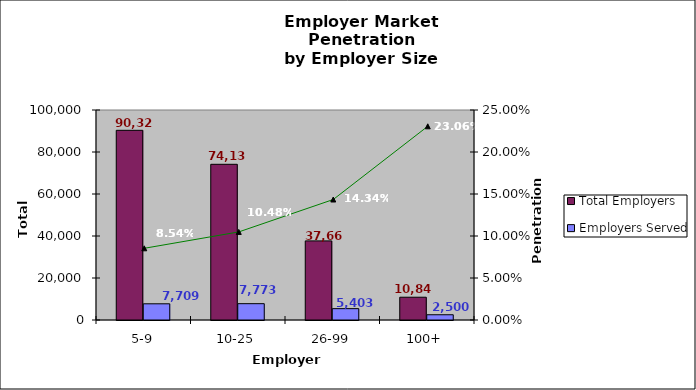
| Category | Total Employers | Employers Served |
|---|---|---|
| 5-9 | 90322 | 7709 |
| 10-25 | 74139 | 7773 |
| 26-99 | 37666 | 5403 |
| 100+ | 10842 | 2500 |